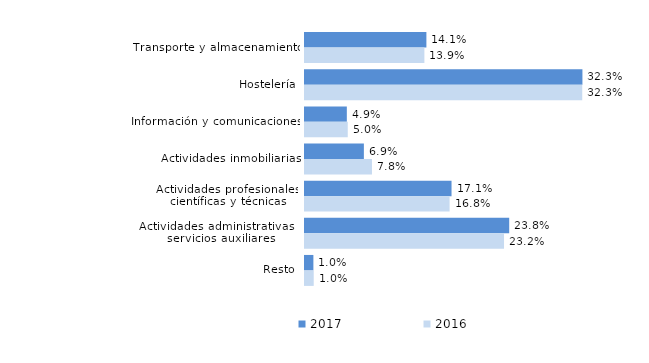
| Category | 2017 | 2016 |
|---|---|---|
| Transporte y almacenamiento | 0.141 | 0.139 |
| Hostelería | 0.323 | 0.323 |
| Información y comunicaciones | 0.049 | 0.05 |
| Actividades inmobiliarias | 0.069 | 0.078 |
| Actividades profesionales, científicas y técnicas | 0.171 | 0.168 |
| Actividades administrativas y servicios auxiliares | 0.238 | 0.232 |
| Resto | 0.01 | 0.01 |